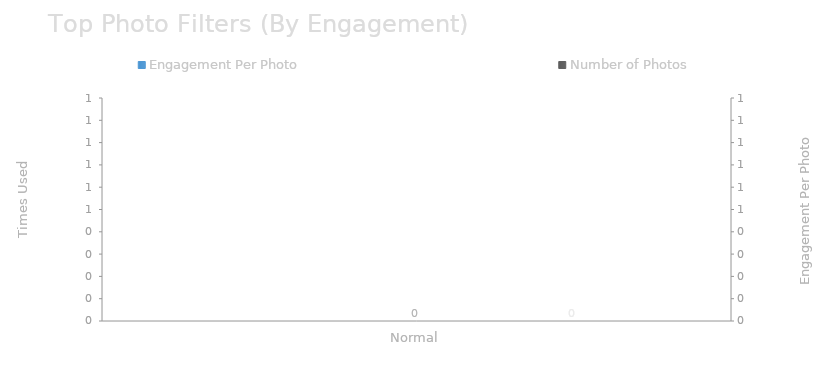
| Category | Engagement Per Photo |
|---|---|
| Normal | 60.75 |